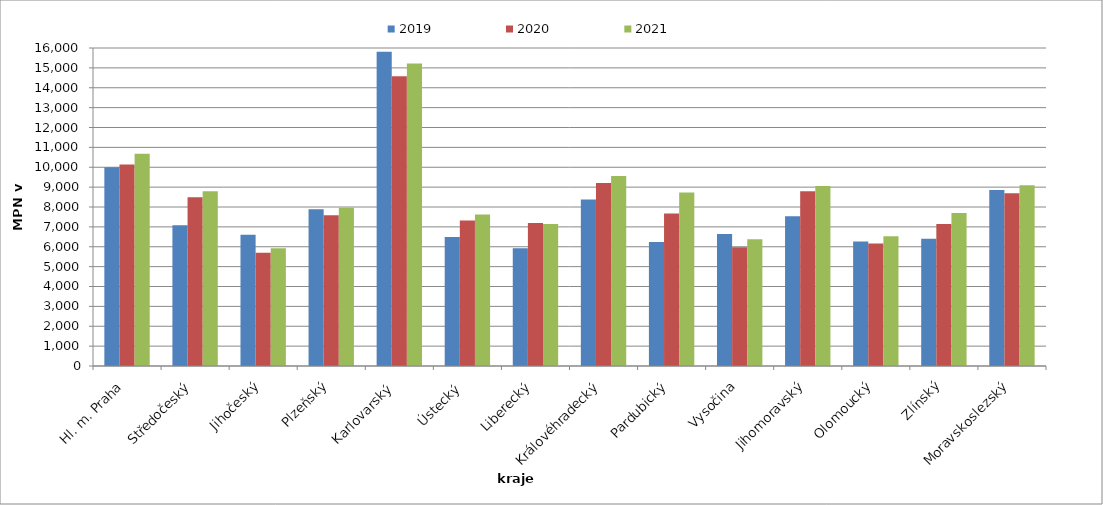
| Category | 2019 | 2020 | 2021 |
|---|---|---|---|
| Hl. m. Praha | 10002.286 | 10140.043 | 10675.773 |
| Středočeský | 7077.522 | 8485.2 | 8795.803 |
| Jihočeský | 6601.722 | 5695.028 | 5922.829 |
| Plzeňský | 7882.5 | 7587 | 7966.5 |
| Karlovarský  | 15806.897 | 14580 | 15219.512 |
| Ústecký   | 6495.652 | 7325.064 | 7618.159 |
| Liberecký | 5923.061 | 7195.196 | 7140.111 |
| Královéhradecký | 8377.465 | 9205.72 | 9555.873 |
| Pardubický | 6238.655 | 7676.386 | 8725.301 |
| Vysočina | 6645.654 | 5975.429 | 6371.72 |
| Jihomoravský | 7531.309 | 8788.295 | 9050.656 |
| Olomoucký | 6259.92 | 6159.3 | 6528.9 |
| Zlínský | 6399.191 | 7149.711 | 7699.422 |
| Moravskoslezský | 8860.439 | 8687.415 | 9093.369 |